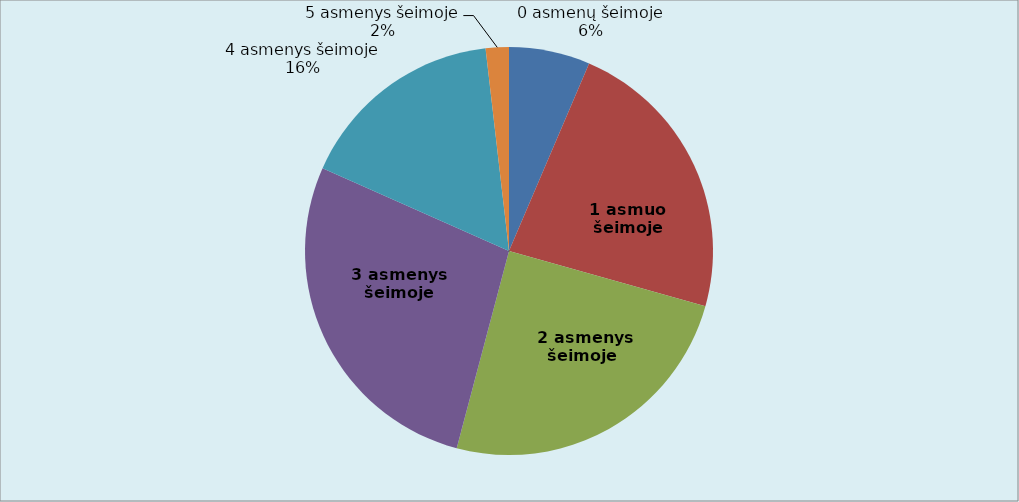
| Category | Series 0 |
|---|---|
| 0 asmenų šeimoje | 7 |
| 1 asmuo šeimoje | 25 |
| 2 asmenys šeimoje  | 27 |
| 3 asmenys šeimoje | 30 |
| 4 asmenys šeimoje | 18 |
| 5 asmenys šeimoje | 2 |